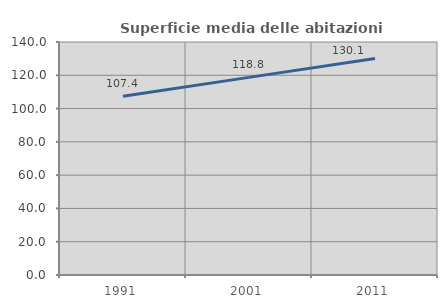
| Category | Superficie media delle abitazioni occupate |
|---|---|
| 1991.0 | 107.356 |
| 2001.0 | 118.751 |
| 2011.0 | 130.107 |